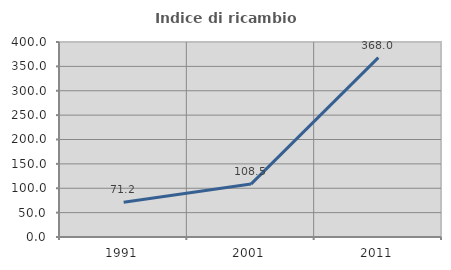
| Category | Indice di ricambio occupazionale  |
|---|---|
| 1991.0 | 71.154 |
| 2001.0 | 108.511 |
| 2011.0 | 368 |